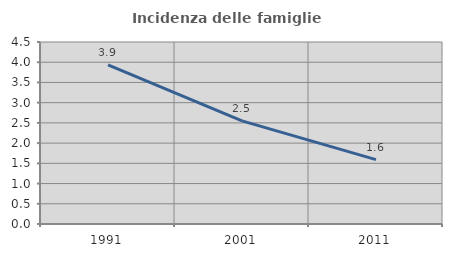
| Category | Incidenza delle famiglie numerose |
|---|---|
| 1991.0 | 3.937 |
| 2001.0 | 2.55 |
| 2011.0 | 1.592 |